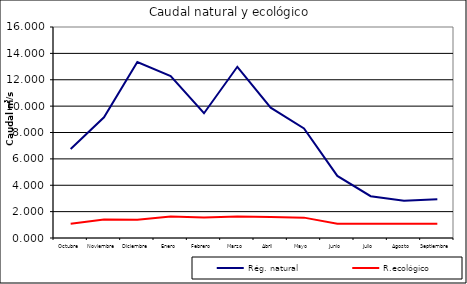
| Category | Rég. natural | R.ecológico |
|---|---|---|
| Octubre | 6.741 | 1.082 |
| Noviembre | 9.149 | 1.41 |
| Diciembre | 13.344 | 1.389 |
| Enero | 12.285 | 1.622 |
| Febrero | 9.463 | 1.56 |
| Marzo | 12.983 | 1.628 |
| Abril | 9.884 | 1.594 |
| Mayo | 8.307 | 1.545 |
| Junio | 4.708 | 1.082 |
| Julio | 3.172 | 1.082 |
| Agosto | 2.822 | 1.082 |
| Septiembre | 2.939 | 1.082 |